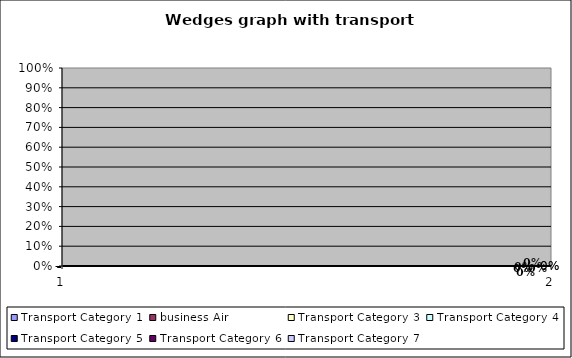
| Category |  Transport Category 1  |  business Air  |  Transport Category 3  |  Transport Category 4  |  Transport Category 5  |  Transport Category 6  |  Transport Category 7  |
|---|---|---|---|---|---|---|---|
| 0 | 0 | 0 | 0 | 0 | 0 | 0 | 0 |
| 1 | 0 | 0 | 0 | 0 | 0 | 0 | 0 |